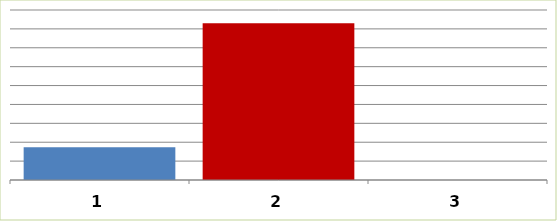
| Category | Series 0 |
|---|---|
| 0 | 8690598 |
| 1 | 41477680 |
| 2 | 0 |